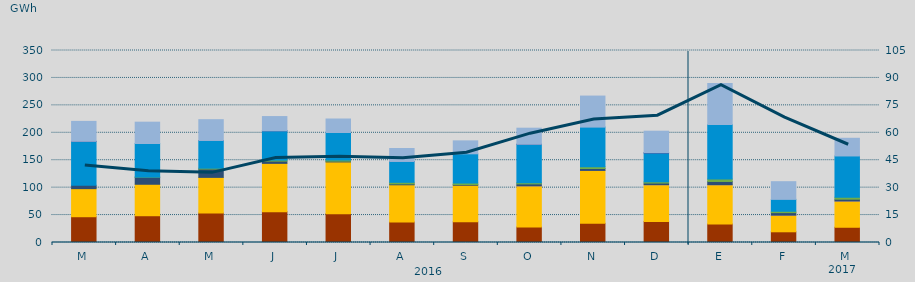
| Category | Carbón | Ciclo Combinado | Cogeneración | Consumo Bombeo | Eólica | Hidráulica | Fuel-Gas | Nuclear | Turbinación bombeo |
|---|---|---|---|---|---|---|---|---|---|
| M | 46981.5 | 51189.9 | 0 | 6160.8 | 0 | 79699.3 | 0 | 394.1 | 36350.1 |
| A | 48797.4 | 57355.9 | 0 | 12859 | 204.7 | 61249.4 | 0 | 0 | 38883.7 |
| M | 53629.9 | 65079.6 | 0 | 15177.5 | 1551.4 | 50504.5 | 0 | 57 | 37889.8 |
| J | 56105.7 | 88155 | 0 | 4098 | 1765.6 | 53472.5 | 0 | 75 | 25898.4 |
| J | 52336 | 94541.2 | 0 | 1399.6 | 1952.7 | 50314 | 0 | 0 | 24575.3 |
| A | 37334.5 | 67871 | 0 | 1577.6 | 2939.5 | 37964.3 | 0 | 25 | 23687.2 |
| S | 37698.5 | 66682.3 | 0 | 1355 | 2661.1 | 53272.9 | 0 | 0 | 23588.2 |
| O | 28157.6 | 75179.9 | 2.2 | 3499.1 | 2164.7 | 70061.5 | 0 | 21.9 | 29280.6 |
| N | 34938.5 | 96462 | 10.5 | 3432.1 | 3197.2 | 72313.8 | 0 | 0 | 56573.1 |
| D | 38367.5 | 66989.6 | 22.7 | 3010.5 | 2208.6 | 52585.3 | 0 | 619.5 | 39099.8 |
| E | 33693.8 | 71645.3 | 16.3 | 5899.1 | 4288.7 | 99664.7 | 0 | 0 | 74414.2 |
| F | 19518.4 | 30319.3 | 9.6 | 4595.7 | 2486.3 | 21689.9 | 0 | 0 | 32220.5 |
| M | 27782.8 | 47861.9 | 30.1 | 3279.6 | 3494.1 | 75296.7 | 0 | 0 | 32248 |